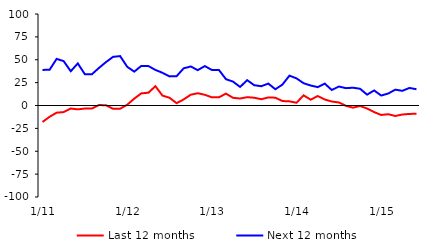
| Category | Last 12 months | Next 12 months |
|---|---|---|
|  1/11 | -17.96 | 38.89 |
|  2/11 | -12.33 | 39.05 |
|  3/11 | -7.84 | 50.96 |
|  4/11 | -7.2 | 48.47 |
|  5/11 | -3.3 | 37.42 |
|  6/11 | -4.21 | 45.99 |
|  7/11 | -3.33 | 34.17 |
|  8/11 | -3.33 | 34.17 |
|  9/11 | 0.51 | 41.09 |
|  10/11 | 0.28 | 47.47 |
|  11/11 | -3.65 | 53.17 |
|  12/11 | -3.52 | 53.99 |
|  1/12 | 0.85 | 42.3 |
|  2/12 | 7.49 | 37.02 |
|  3/12 | 13.29 | 43.26 |
|  4/12 | 13.96 | 43.14 |
|  5/12 | 21.08 | 38.87 |
|  6/12 | 10.81 | 35.74 |
|  7/12 | 8.46 | 31.81 |
|  8/12 | 2.55 | 32.03 |
|  9/12 | 6.58 | 40.6 |
|  10/12 | 11.79 | 42.65 |
|  11/12 | 13.41 | 38.66 |
|  12/12 | 11.71 | 43.07 |
|  1/13 | 8.92 | 38.82 |
|  2/13 | 8.92 | 38.82 |
|  3/13 | 12.98 | 28.75 |
|  4/13 | 8.4 | 26.12 |
|  5/13 | 7.64 | 20.26 |
|  6/13 | 9.1 | 27.71 |
|  7/13 | 8.51 | 22.2 |
|  8/13 | 6.89 | 21.06 |
|  9/13 | 8.81 | 23.95 |
|  10/13 | 8.54 | 17.76 |
|  11/13 | 4.88 | 22.87 |
|  12/13 | 4.53 | 32.62 |
|  1/14 | 2.99 | 29.64 |
|  2/14 | 11.1 | 24.37 |
|  3/14 | 6.35 | 21.86 |
|  4/14 | 10.34 | 20.09 |
|  5/14 | 6.57 | 23.91 |
|  6/14 | 4.33 | 16.91 |
|  7/14 | 3.35 | 20.75 |
|  8/14 | -0.33 | 18.95 |
|  9/14 | -2.37 | 19.44 |
|  10/14 | -0.5 | 18.32 |
|  11/14 | -3.3 | 11.85 |
|  12/14 | -7.21 | 16.46 |
|  1/15 | -10.32 | 10.88 |
|  2/15 | -9.55 | 13.1 |
|  3/15 | -11.45 | 17.32 |
|  4/15 | -9.85 | 16.04 |
|  5/15 | -9.22 | 19.19 |
|  6/15 | -8.99 | 17.77 |